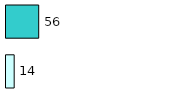
| Category | Series 0 | Series 1 |
|---|---|---|
| 0 | 14 | 56 |